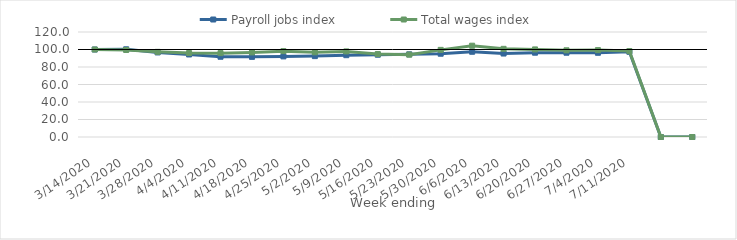
| Category | Payroll jobs index | Total wages index |
|---|---|---|
| 14/03/2020 | 100 | 100 |
| 21/03/2020 | 100.232 | 99.439 |
| 28/03/2020 | 96.638 | 97.314 |
| 04/04/2020 | 94.309 | 95.944 |
| 11/04/2020 | 91.709 | 95.848 |
| 18/04/2020 | 91.573 | 96.682 |
| 25/04/2020 | 92.124 | 98.121 |
| 02/05/2020 | 92.443 | 96.771 |
| 09/05/2020 | 93.489 | 97.806 |
| 16/05/2020 | 94.024 | 94.8 |
| 23/05/2020 | 94.478 | 94.124 |
| 30/05/2020 | 95.176 | 99.585 |
| 06/06/2020 | 97.405 | 104.355 |
| 13/06/2020 | 95.39 | 100.752 |
| 20/06/2020 | 96.335 | 100.098 |
| 27/06/2020 | 96.314 | 99.084 |
| 04/07/2020 | 96.233 | 99.299 |
| 11/07/2020 | 97.407 | 98.195 |